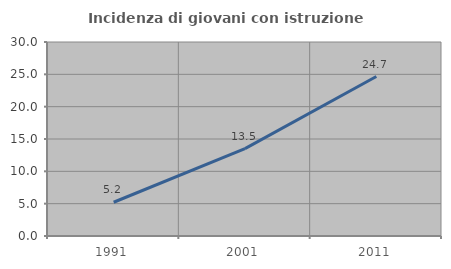
| Category | Incidenza di giovani con istruzione universitaria |
|---|---|
| 1991.0 | 5.217 |
| 2001.0 | 13.514 |
| 2011.0 | 24.658 |